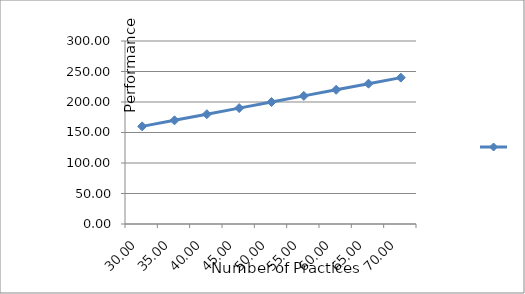
| Category | Series 0 |
|---|---|
| 30.0 | 160 |
| 35.0 | 170 |
| 40.0 | 180 |
| 45.0 | 190 |
| 50.0 | 200 |
| 55.0 | 210 |
| 60.0 | 220 |
| 65.0 | 230 |
| 70.0 | 240 |